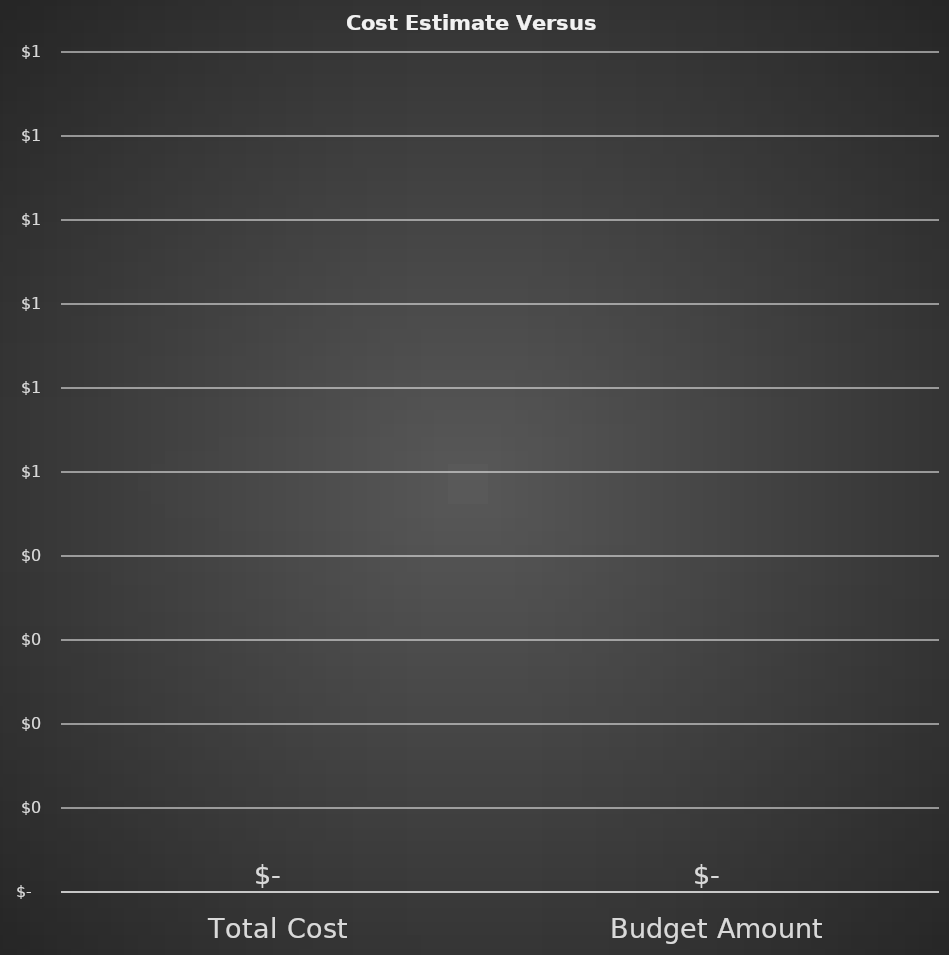
| Category | Series 0 |
|---|---|
| Total Cost | 0 |
|  Budget Amount  | 0 |